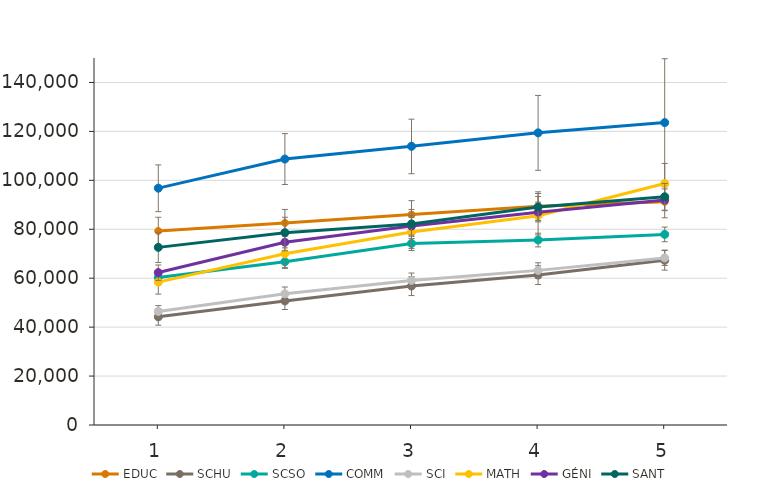
| Category | EDUC | SCHU | SCSO | COMM | SCI | MATH | GÉNI | SANT |
|---|---|---|---|---|---|---|---|---|
| 1.0 | 79300 | 44200 | 60300 | 96800 | 46400 | 58400 | 62300 | 72600 |
| 2.0 | 82600 | 50700 | 66700 | 108700 | 53600 | 70000 | 74700 | 78600 |
| 3.0 | 86000 | 56800 | 74200 | 113900 | 59100 | 78900 | 81300 | 82200 |
| 4.0 | 89400 | 61300 | 75600 | 119400 | 63200 | 85500 | 87000 | 89100 |
| 5.0 | 91200 | 67300 | 77900 | 123600 | 68300 | 98700 | 92000 | 93300 |